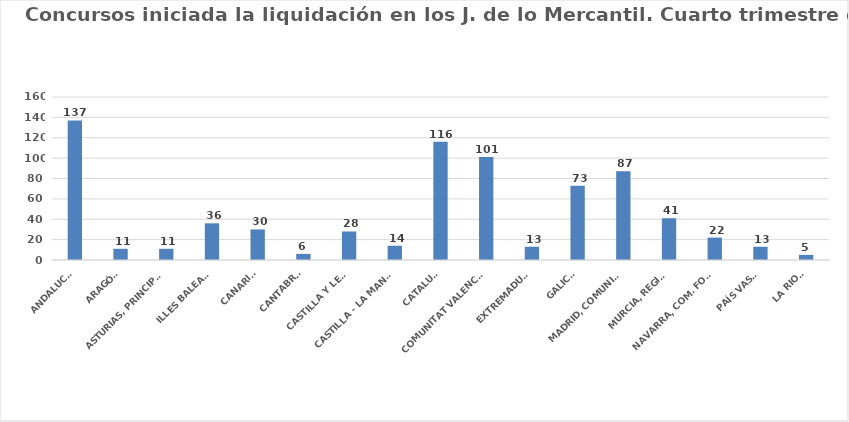
| Category | Series 0 |
|---|---|
| ANDALUCÍA | 137 |
| ARAGÓN | 11 |
| ASTURIAS, PRINCIPADO | 11 |
| ILLES BALEARS | 36 |
| CANARIAS | 30 |
| CANTABRIA | 6 |
| CASTILLA Y LEÓN | 28 |
| CASTILLA - LA MANCHA | 14 |
| CATALUÑA | 116 |
| COMUNITAT VALENCIANA | 101 |
| EXTREMADURA | 13 |
| GALICIA | 73 |
| MADRID, COMUNIDAD | 87 |
| MURCIA, REGIÓN | 41 |
| NAVARRA, COM. FORAL | 22 |
| PAÍS VASCO | 13 |
| LA RIOJA | 5 |